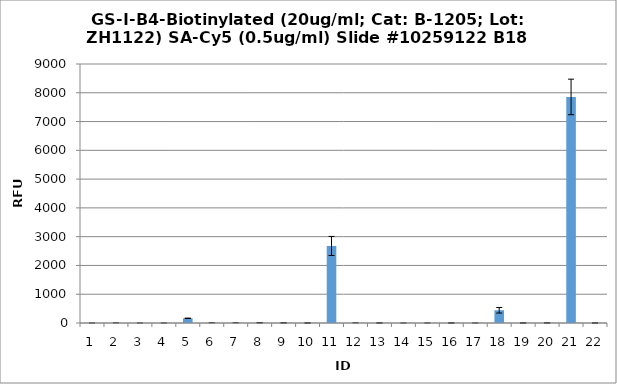
| Category | Series 0 |
|---|---|
| 0 | 0.25 |
| 1 | 2.5 |
| 2 | 0 |
| 3 | 0.25 |
| 4 | 163.5 |
| 5 | 3.5 |
| 6 | 3.75 |
| 7 | 9 |
| 8 | 5.5 |
| 9 | 1 |
| 10 | 2677.5 |
| 11 | 2.75 |
| 12 | 2.75 |
| 13 | 0.25 |
| 14 | 0 |
| 15 | 1.25 |
| 16 | 0.25 |
| 17 | 442.75 |
| 18 | 1.5 |
| 19 | 3.75 |
| 20 | 7855.25 |
| 21 | -0.5 |